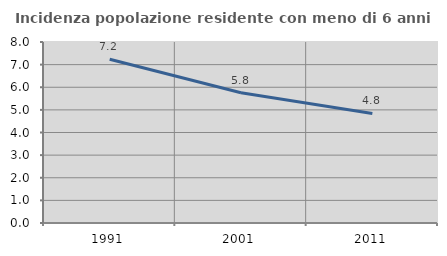
| Category | Incidenza popolazione residente con meno di 6 anni |
|---|---|
| 1991.0 | 7.241 |
| 2001.0 | 5.754 |
| 2011.0 | 4.841 |